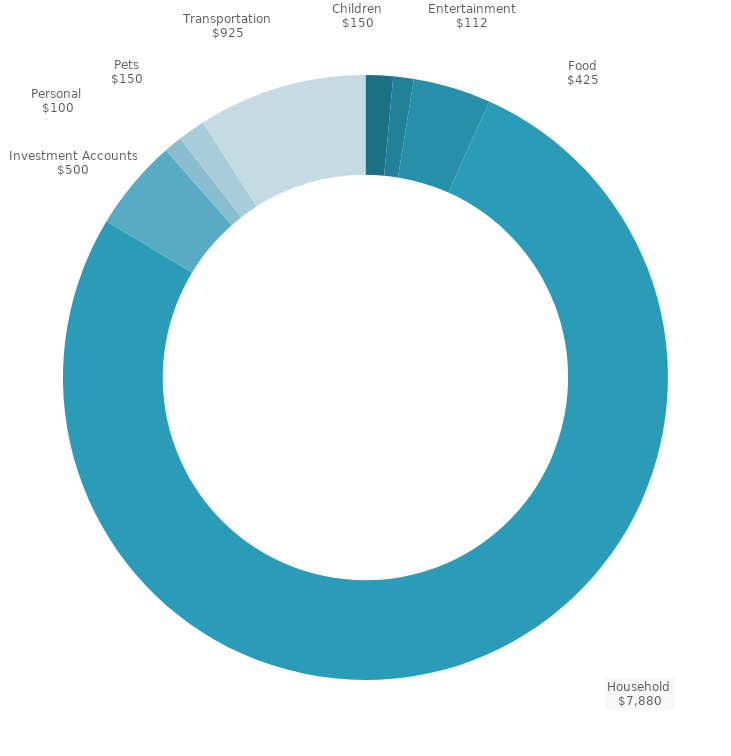
| Category | Total |
|---|---|
| Children | 150 |
| Entertainment | 112 |
| Food | 425 |
| Household | 7880 |
| Investment Accounts | 500 |
| Personal | 100 |
| Pets | 150 |
| Transportation | 925 |